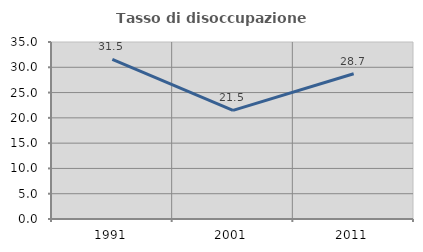
| Category | Tasso di disoccupazione giovanile  |
|---|---|
| 1991.0 | 31.548 |
| 2001.0 | 21.484 |
| 2011.0 | 28.726 |